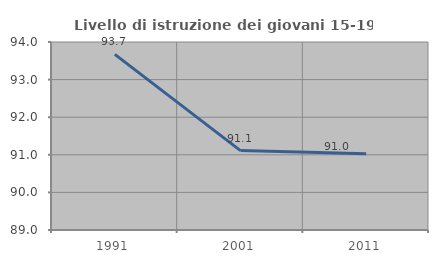
| Category | Livello di istruzione dei giovani 15-19 anni |
|---|---|
| 1991.0 | 93.671 |
| 2001.0 | 91.111 |
| 2011.0 | 91.026 |